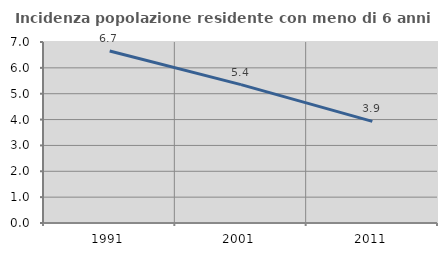
| Category | Incidenza popolazione residente con meno di 6 anni |
|---|---|
| 1991.0 | 6.65 |
| 2001.0 | 5.353 |
| 2011.0 | 3.93 |